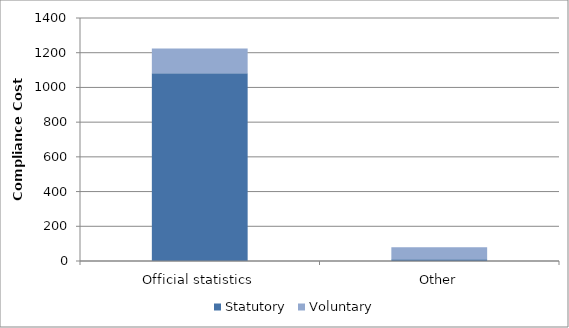
| Category | Statutory | Voluntary |
|---|---|---|
| Official statistics | 1081 | 144 |
| Other | 10 | 69 |